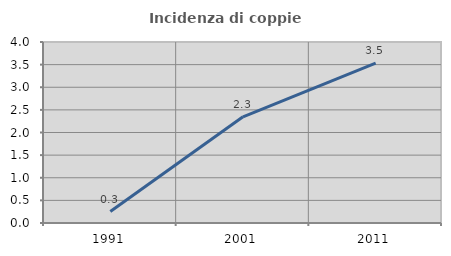
| Category | Incidenza di coppie miste |
|---|---|
| 1991.0 | 0.254 |
| 2001.0 | 2.347 |
| 2011.0 | 3.532 |